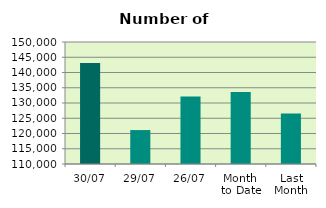
| Category | Series 0 |
|---|---|
| 30/07 | 143122 |
| 29/07 | 121122 |
| 26/07 | 132134 |
| Month 
to Date | 133625.364 |
| Last
Month | 126531 |